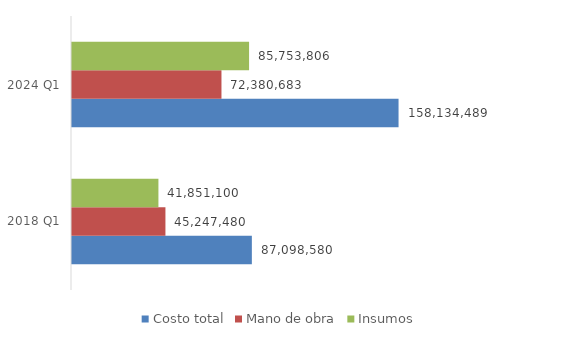
| Category | Costo total | Mano de obra | Insumos |
|---|---|---|---|
| 2018 Q1 | 87098580 | 45247480 | 41851100 |
| 2024 Q1 | 158134489.163 | 72380683 | 85753806.163 |